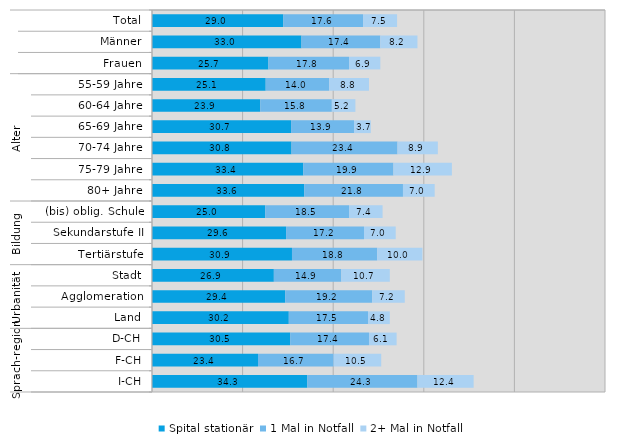
| Category | Spital stationär | 1 Mal in Notfall | 2+ Mal in Notfall |
|---|---|---|---|
| 0 | 29 | 17.6 | 7.5 |
| 1 | 33 | 17.4 | 8.2 |
| 2 | 25.7 | 17.8 | 6.9 |
| 3 | 25.1 | 14 | 8.8 |
| 4 | 23.9 | 15.8 | 5.2 |
| 5 | 30.7 | 13.9 | 3.7 |
| 6 | 30.8 | 23.4 | 8.9 |
| 7 | 33.4 | 19.9 | 12.9 |
| 8 | 33.6 | 21.8 | 7 |
| 9 | 25 | 18.5 | 7.4 |
| 10 | 29.6 | 17.2 | 7 |
| 11 | 30.9 | 18.8 | 10 |
| 12 | 26.9 | 14.9 | 10.7 |
| 13 | 29.4 | 19.2 | 7.2 |
| 14 | 30.2 | 17.5 | 4.8 |
| 15 | 30.5 | 17.4 | 6.1 |
| 16 | 23.4 | 16.7 | 10.5 |
| 17 | 34.3 | 24.3 | 12.4 |